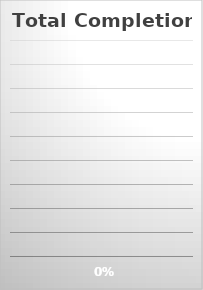
| Category | Series 0 |
|---|---|
| Total Percentage Complete: | 0 |